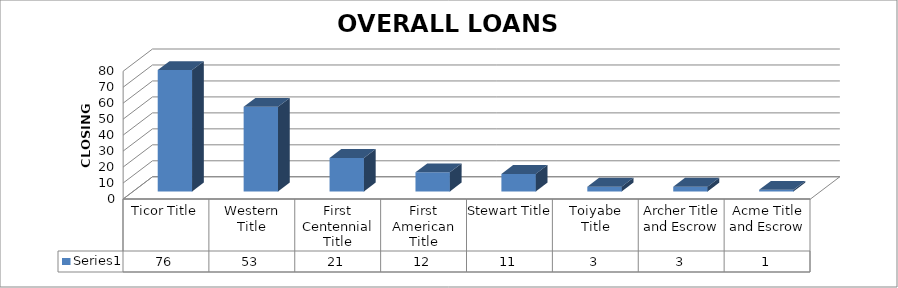
| Category | Series 0 |
|---|---|
| Ticor Title | 76 |
| Western Title | 53 |
| First Centennial Title | 21 |
| First American Title | 12 |
| Stewart Title | 11 |
| Toiyabe Title | 3 |
| Archer Title and Escrow | 3 |
| Acme Title and Escrow | 1 |